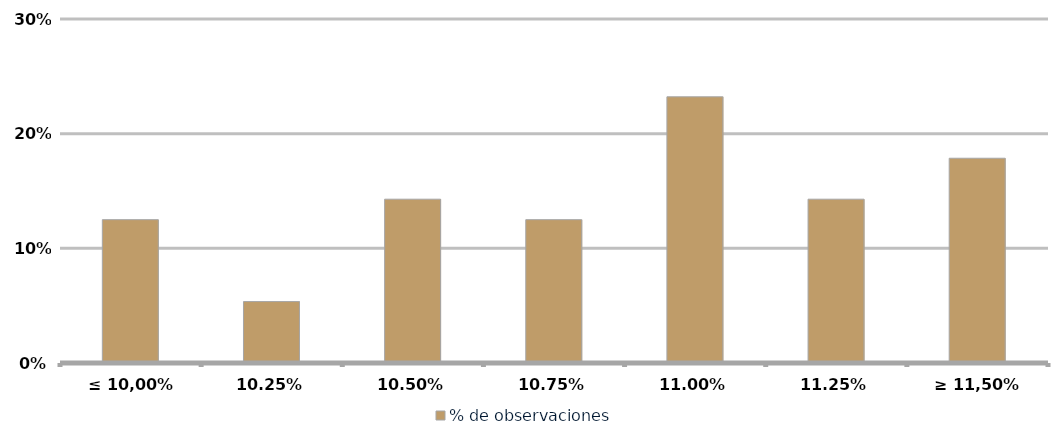
| Category | % de observaciones  |
|---|---|
| ≤ 10,00% | 0.125 |
| 10,25% | 0.054 |
| 10,50% | 0.143 |
| 10,75% | 0.125 |
| 11,00% | 0.232 |
| 11,25% | 0.143 |
| ≥ 11,50% | 0.179 |